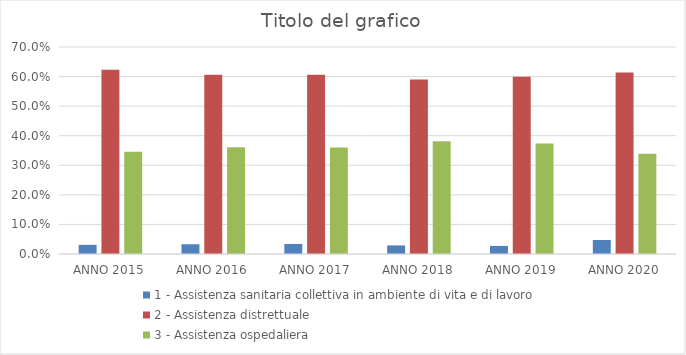
| Category | 1 - Assistenza sanitaria collettiva in ambiente di vita e di lavoro | 2 - Assistenza distrettuale | 3 - Assistenza ospedaliera |
|---|---|---|---|
| ANNO 2015 | 0.031 | 0.623 | 0.346 |
| ANNO 2016 | 0.033 | 0.606 | 0.361 |
| ANNO 2017 | 0.034 | 0.606 | 0.36 |
| ANNO 2018 | 0.029 | 0.59 | 0.381 |
| ANNO 2019 | 0.027 | 0.599 | 0.374 |
| ANNO 2020 | 0.047 | 0.614 | 0.339 |